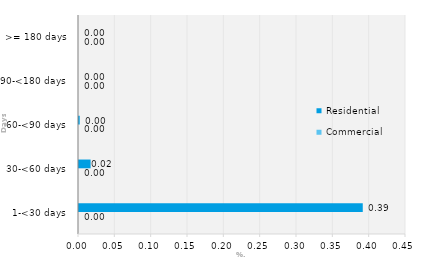
| Category | Commercial | Residential |
|---|---|---|
| 1-<30 days | 0 | 0.391 |
| 30-<60 days | 0 | 0.016 |
| 60-<90 days | 0 | 0.001 |
| 90-<180 days | 0 | 0 |
| >= 180 days | 0 | 0 |